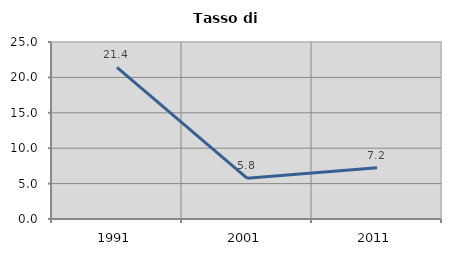
| Category | Tasso di disoccupazione   |
|---|---|
| 1991.0 | 21.429 |
| 2001.0 | 5.769 |
| 2011.0 | 7.229 |